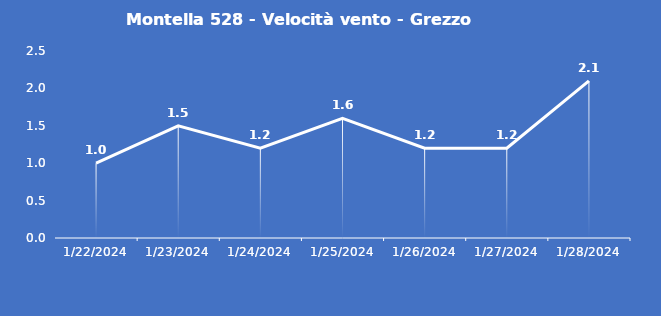
| Category | Montella 528 - Velocità vento - Grezzo (m/s) |
|---|---|
| 1/22/24 | 1 |
| 1/23/24 | 1.5 |
| 1/24/24 | 1.2 |
| 1/25/24 | 1.6 |
| 1/26/24 | 1.2 |
| 1/27/24 | 1.2 |
| 1/28/24 | 2.1 |